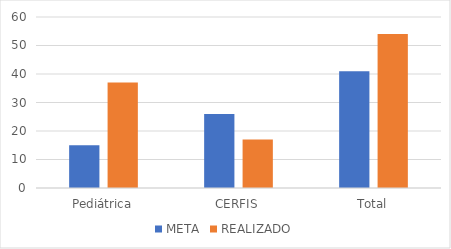
| Category | META | REALIZADO |
|---|---|---|
| Pediátrica | 15 | 37 |
| CERFIS | 26 | 17 |
| Total | 41 | 54 |